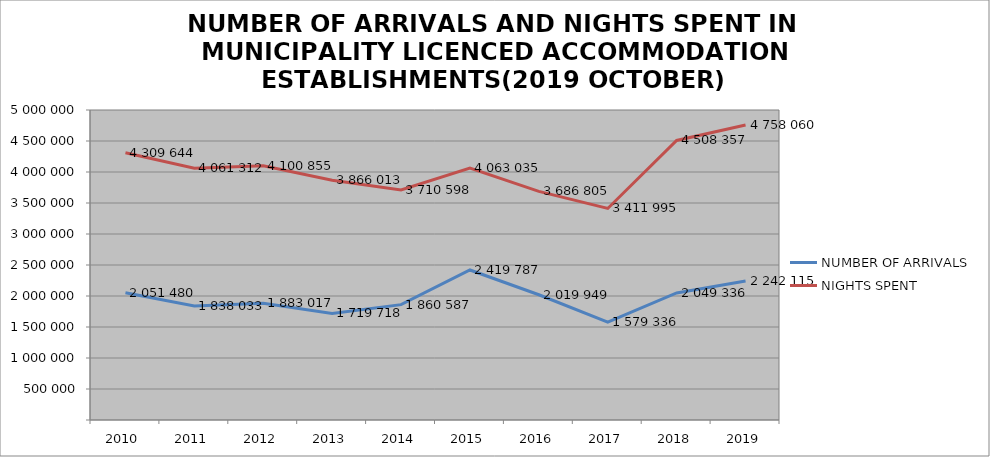
| Category | NUMBER OF ARRIVALS | NIGHTS SPENT |
|---|---|---|
| 2010 | 2051480 | 4309644 |
| 2011 | 1838033 | 4061312 |
| 2012 | 1883017 | 4100855 |
| 2013 | 1719718 | 3866013 |
| 2014 | 1860587 | 3710598 |
| 2015 | 2419787 | 4063035 |
| 2016 | 2019949 | 3686805 |
| 2017 | 1579336 | 3411995 |
| 2018 | 2049336 | 4508357 |
| 2019 | 2242115 | 4758060 |